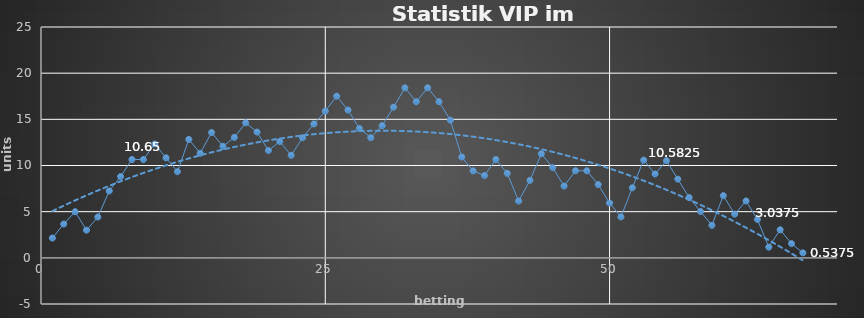
| Category | Series 0 |
|---|---|
| 0 | 2.14 |
| 1 | 3.66 |
| 2 | 4.995 |
| 3 | 2.995 |
| 4 | 4.42 |
| 5 | 7.24 |
| 6 | 8.8 |
| 7 | 10.65 |
| 8 | 10.65 |
| 9 | 12.33 |
| 10 | 10.83 |
| 11 | 9.33 |
| 12 | 12.825 |
| 13 | 11.325 |
| 14 | 13.575 |
| 15 | 12.075 |
| 16 | 13.045 |
| 17 | 14.62 |
| 18 | 13.62 |
| 19 | 11.62 |
| 20 | 12.6 |
| 21 | 11.1 |
| 22 | 13 |
| 23 | 14.5 |
| 24 | 15.888 |
| 25 | 17.508 |
| 26 | 16.008 |
| 27 | 14.008 |
| 28 | 13.008 |
| 29 | 14.312 |
| 30 | 16.312 |
| 31 | 18.412 |
| 32 | 16.912 |
| 33 | 18.412 |
| 34 | 16.912 |
| 35 | 14.913 |
| 36 | 10.913 |
| 37 | 9.413 |
| 38 | 8.913 |
| 39 | 10.653 |
| 40 | 9.153 |
| 41 | 6.153 |
| 42 | 8.393 |
| 43 | 11.272 |
| 44 | 9.772 |
| 45 | 7.773 |
| 46 | 9.433 |
| 47 | 9.433 |
| 48 | 7.933 |
| 49 | 5.933 |
| 50 | 4.433 |
| 51 | 7.583 |
| 52 | 10.582 |
| 53 | 9.082 |
| 54 | 10.522 |
| 55 | 8.522 |
| 56 | 6.522 |
| 57 | 5.022 |
| 58 | 3.522 |
| 59 | 6.732 |
| 60 | 4.732 |
| 61 | 6.157 |
| 62 | 4.157 |
| 63 | 1.157 |
| 64 | 3.037 |
| 65 | 1.537 |
| 66 | 0.537 |